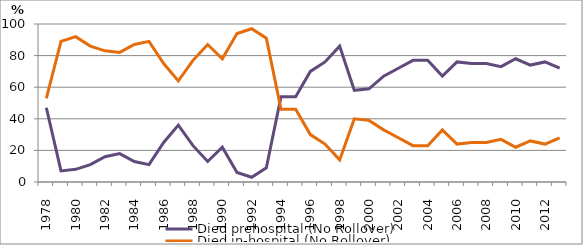
| Category | Died prehospital (No Rollover) | Died in-hospital (No Rollover) |
|---|---|---|
| 1978.0 | 47 | 53 |
| 1979.0 | 7 | 89 |
| 1980.0 | 8 | 92 |
| 1981.0 | 11 | 86 |
| 1982.0 | 16 | 83 |
| 1983.0 | 18 | 82 |
| 1984.0 | 13 | 87 |
| 1985.0 | 11 | 89 |
| 1986.0 | 25 | 75 |
| 1987.0 | 36 | 64 |
| 1988.0 | 23 | 77 |
| 1989.0 | 13 | 87 |
| 1990.0 | 22 | 78 |
| 1991.0 | 6 | 94 |
| 1992.0 | 3 | 97 |
| 1993.0 | 9 | 91 |
| 1994.0 | 54 | 46 |
| 1995.0 | 54 | 46 |
| 1996.0 | 70 | 30 |
| 1997.0 | 76 | 24 |
| 1998.0 | 86 | 14 |
| 1999.0 | 58 | 40 |
| 2000.0 | 59 | 39 |
| 2001.0 | 67 | 33 |
| 2002.0 | 72 | 28 |
| 2003.0 | 77 | 23 |
| 2004.0 | 77 | 23 |
| 2005.0 | 67 | 33 |
| 2006.0 | 76 | 24 |
| 2007.0 | 75 | 25 |
| 2008.0 | 75 | 25 |
| 2009.0 | 73 | 27 |
| 2010.0 | 78 | 22 |
| 2011.0 | 74 | 26 |
| 2012.0 | 76 | 24 |
| 2013.0 | 72 | 28 |